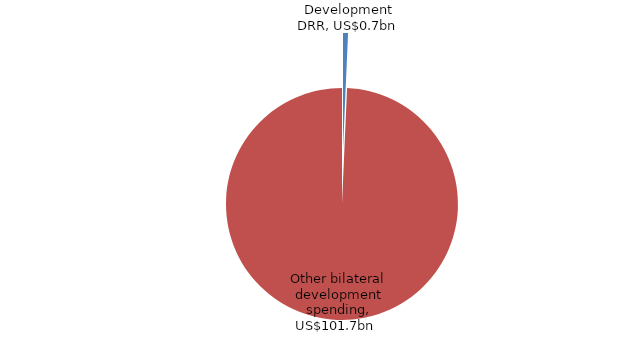
| Category | Total DAC DONOR spending |
|---|---|
| Development DRR (US$bn) | 0.712 |
| Other bilateral development spending 2011 (US$bn) | 101.65 |